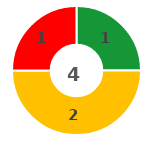
| Category | Series 0 |
|---|---|
| 0 | 1 |
| 1 | 0 |
| 2 | 2 |
| 3 | 1 |
| 4 | 0 |